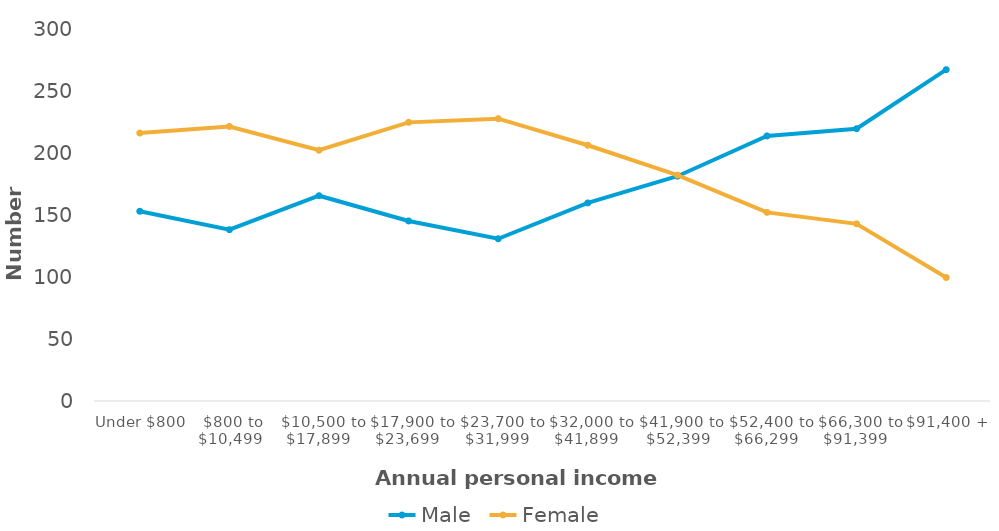
| Category | Male | Female |
|---|---|---|
| Under $800 | 152.6 | 215.5 |
|  $800 to $10,499 | 137.8 | 220.8 |
|  $10,500 to $17,899  | 165.1 | 201.7 |
|  $17,900 to $23,699  | 144.8 | 224.1 |
|  $23,700 to $31,999  | 130.5 | 227.1 |
|  $32,000 to $41,899  | 159.3 | 205.7 |
|  $41,900 to $52,399 | 180.8 | 181.7 |
|  $52,400 to $66,299  | 213.2 | 151.7 |
|  $66,300 to $91,399  | 219 | 142.5 |
|  $91,400 + | 266.5 | 99.3 |